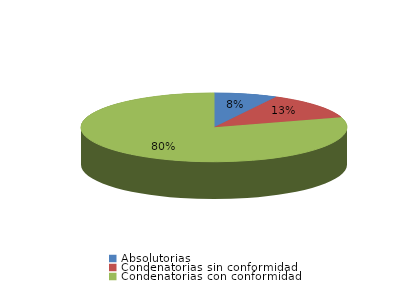
| Category | Series 0 |
|---|---|
| Absolutorias | 8 |
| Condenatorias sin conformidad | 13 |
| Condenatorias con conformidad | 83 |